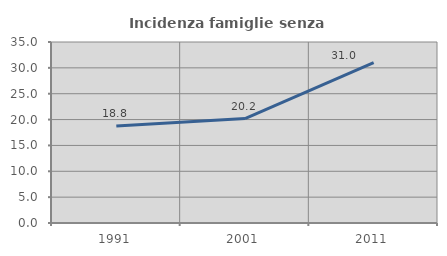
| Category | Incidenza famiglie senza nuclei |
|---|---|
| 1991.0 | 18.765 |
| 2001.0 | 20.186 |
| 2011.0 | 31.001 |